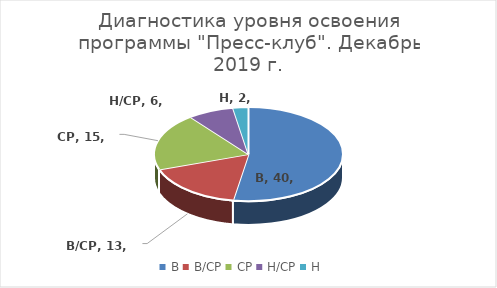
| Category | Series 0 |
|---|---|
| В | 40 |
| В/СР | 13 |
| СР | 15 |
| Н/СР | 6 |
| Н | 2 |